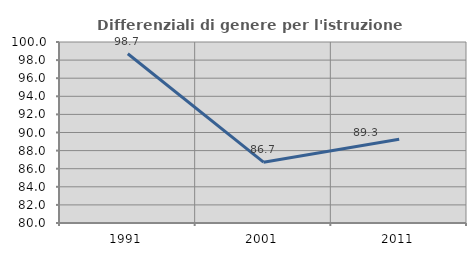
| Category | Differenziali di genere per l'istruzione superiore |
|---|---|
| 1991.0 | 98.699 |
| 2001.0 | 86.719 |
| 2011.0 | 89.265 |